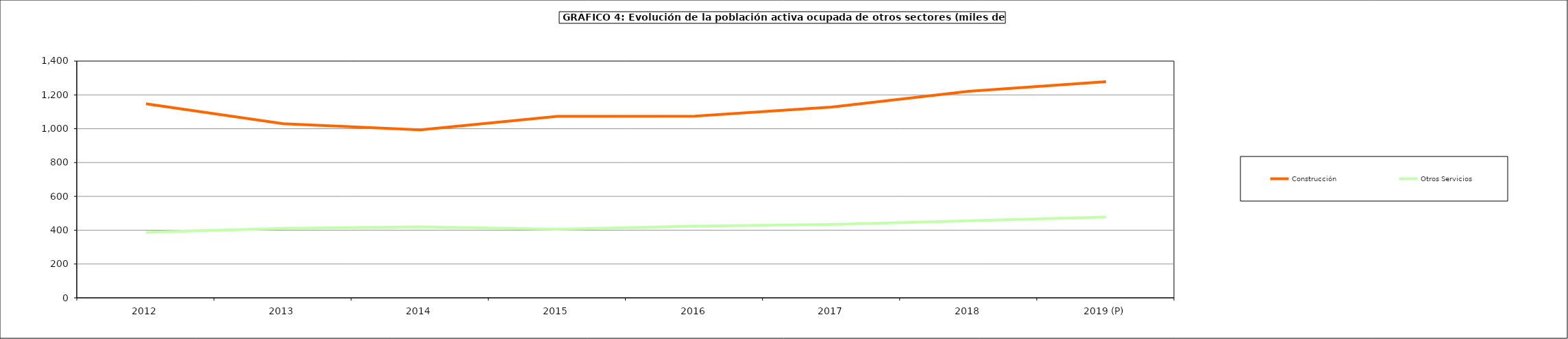
| Category | Construcción | Otros Servicios |
|---|---|---|
| 2012 | 1147.575 | 387.25 |
| 2013 | 1029.6 | 410.85 |
| 2014 | 993.5 | 419.6 |
| 2015 | 1073.65 | 405.475 |
| 2016 | 1073.9 | 424.325 |
| 2017 | 1128.3 | 434.6 |
| 2018 | 1221.8 | 455.3 |
| 2019 (P) | 1277.9 | 477.775 |